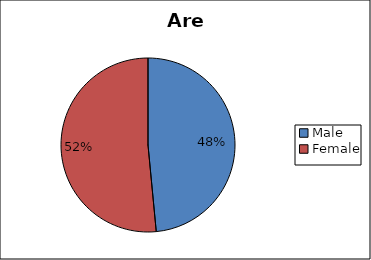
| Category | Series 0 |
|---|---|
| Male | 0.485 |
| Female | 0.515 |